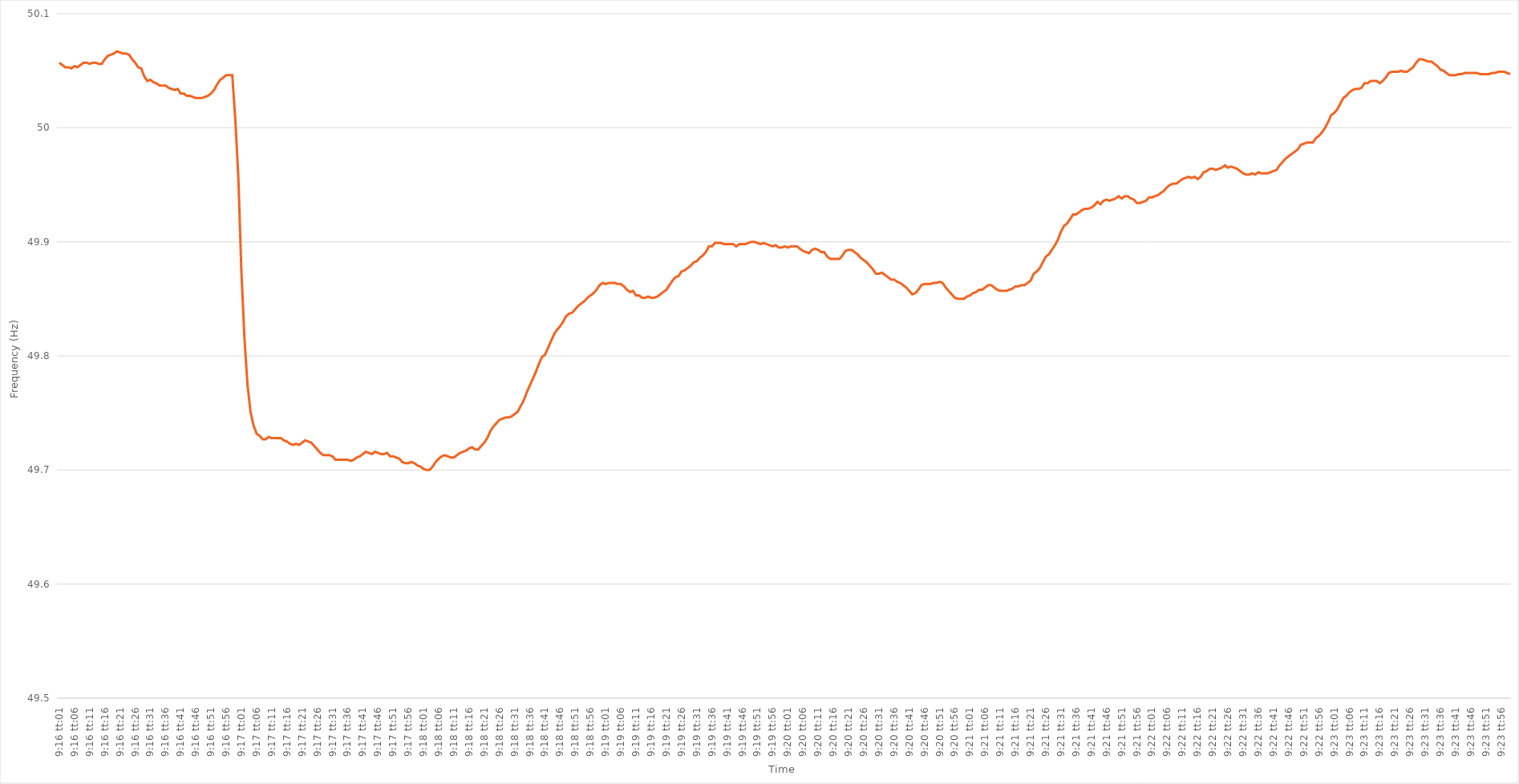
| Category | Series 0 |
|---|---|
| 0.38612268518518517 | 50.057 |
| 0.3861342592592593 | 50.055 |
| 0.38614583333333335 | 50.053 |
| 0.3861574074074074 | 50.053 |
| 0.3861689814814815 | 50.052 |
| 0.3861805555555555 | 50.054 |
| 0.3861921296296296 | 50.053 |
| 0.38620370370370366 | 50.055 |
| 0.3862152777777778 | 50.057 |
| 0.38622685185185185 | 50.057 |
| 0.38623842592592594 | 50.056 |
| 0.38625 | 50.057 |
| 0.3862615740740741 | 50.057 |
| 0.3862731481481481 | 50.056 |
| 0.38628472222222227 | 50.056 |
| 0.3862962962962963 | 50.06 |
| 0.3863078703703704 | 50.063 |
| 0.38631944444444444 | 50.064 |
| 0.38633101851851853 | 50.065 |
| 0.38634259259259257 | 50.067 |
| 0.3863541666666667 | 50.066 |
| 0.38636574074074076 | 50.065 |
| 0.3863773148148148 | 50.065 |
| 0.3863888888888889 | 50.064 |
| 0.38640046296296293 | 50.06 |
| 0.386412037037037 | 50.057 |
| 0.38642361111111106 | 50.053 |
| 0.3864351851851852 | 50.052 |
| 0.38644675925925925 | 50.045 |
| 0.38645833333333335 | 50.041 |
| 0.3864699074074074 | 50.042 |
| 0.3864814814814815 | 50.04 |
| 0.3864930555555555 | 50.039 |
| 0.38650462962962967 | 50.037 |
| 0.3865162037037037 | 50.037 |
| 0.3865277777777778 | 50.037 |
| 0.38653935185185184 | 50.035 |
| 0.38655092592592594 | 50.034 |
| 0.3865625 | 50.033 |
| 0.3865740740740741 | 50.034 |
| 0.38658564814814816 | 50.03 |
| 0.3865972222222222 | 50.03 |
| 0.3866087962962963 | 50.028 |
| 0.38662037037037034 | 50.028 |
| 0.38663194444444443 | 50.027 |
| 0.38664351851851847 | 50.026 |
| 0.3866550925925926 | 50.026 |
| 0.38666666666666666 | 50.026 |
| 0.38667824074074075 | 50.027 |
| 0.3866898148148148 | 50.028 |
| 0.3867013888888889 | 50.03 |
| 0.3867129629629629 | 50.033 |
| 0.3867245370370371 | 50.038 |
| 0.3867361111111111 | 50.042 |
| 0.3867476851851852 | 50.044 |
| 0.38675925925925925 | 50.046 |
| 0.38677083333333334 | 50.046 |
| 0.3867824074074074 | 50.046 |
| 0.38679398148148153 | 50.007 |
| 0.38680555555555557 | 49.956 |
| 0.38681712962962966 | 49.874 |
| 0.3868287037037037 | 49.816 |
| 0.3868402777777778 | 49.775 |
| 0.38685185185185184 | 49.751 |
| 0.3868634259259259 | 49.739 |
| 0.386875 | 49.732 |
| 0.38688657407407406 | 49.73 |
| 0.38689814814814816 | 49.727 |
| 0.3869097222222222 | 49.727 |
| 0.3869212962962963 | 49.729 |
| 0.38693287037037033 | 49.728 |
| 0.3869444444444445 | 49.728 |
| 0.3869560185185185 | 49.728 |
| 0.3869675925925926 | 49.728 |
| 0.38697916666666665 | 49.726 |
| 0.38699074074074075 | 49.725 |
| 0.3870023148148148 | 49.723 |
| 0.38701388888888894 | 49.722 |
| 0.387025462962963 | 49.723 |
| 0.38703703703703707 | 49.722 |
| 0.3870486111111111 | 49.724 |
| 0.3870601851851852 | 49.726 |
| 0.38707175925925924 | 49.725 |
| 0.3870833333333333 | 49.724 |
| 0.38709490740740743 | 49.721 |
| 0.38710648148148147 | 49.718 |
| 0.38711805555555556 | 49.715 |
| 0.3871296296296296 | 49.713 |
| 0.3871412037037037 | 49.713 |
| 0.38715277777777773 | 49.713 |
| 0.3871643518518519 | 49.712 |
| 0.3871759259259259 | 49.709 |
| 0.3871875 | 49.709 |
| 0.38719907407407406 | 49.709 |
| 0.38721064814814815 | 49.709 |
| 0.3872222222222222 | 49.709 |
| 0.38723379629629634 | 49.708 |
| 0.3872453703703704 | 49.709 |
| 0.3872569444444445 | 49.711 |
| 0.3872685185185185 | 49.712 |
| 0.3872800925925926 | 49.714 |
| 0.38729166666666665 | 49.716 |
| 0.3873032407407407 | 49.715 |
| 0.38731481481481483 | 49.714 |
| 0.3873263888888889 | 49.716 |
| 0.38733796296296297 | 49.715 |
| 0.387349537037037 | 49.714 |
| 0.3873611111111111 | 49.714 |
| 0.38737268518518514 | 49.715 |
| 0.3873842592592593 | 49.712 |
| 0.38739583333333333 | 49.712 |
| 0.3874074074074074 | 49.711 |
| 0.38741898148148146 | 49.71 |
| 0.38743055555555556 | 49.707 |
| 0.3874421296296296 | 49.706 |
| 0.38745370370370374 | 49.706 |
| 0.3874652777777778 | 49.707 |
| 0.3874768518518519 | 49.706 |
| 0.3874884259259259 | 49.704 |
| 0.3875 | 49.703 |
| 0.38751157407407405 | 49.701 |
| 0.3875231481481482 | 49.7 |
| 0.38753472222222224 | 49.7 |
| 0.38754629629629633 | 49.703 |
| 0.38755787037037037 | 49.707 |
| 0.3875694444444444 | 49.71 |
| 0.3875810185185185 | 49.712 |
| 0.38759259259259254 | 49.713 |
| 0.3876041666666667 | 49.712 |
| 0.38761574074074073 | 49.711 |
| 0.3876273148148148 | 49.711 |
| 0.38763888888888887 | 49.713 |
| 0.38765046296296296 | 49.715 |
| 0.387662037037037 | 49.716 |
| 0.38767361111111115 | 49.717 |
| 0.3876851851851852 | 49.719 |
| 0.3876967592592593 | 49.72 |
| 0.3877083333333333 | 49.718 |
| 0.3877199074074074 | 49.718 |
| 0.38773148148148145 | 49.721 |
| 0.3877430555555556 | 49.724 |
| 0.38775462962962964 | 49.728 |
| 0.38776620370370374 | 49.734 |
| 0.3877777777777778 | 49.738 |
| 0.3877893518518518 | 49.741 |
| 0.3878009259259259 | 49.744 |
| 0.38781249999999995 | 49.745 |
| 0.3878240740740741 | 49.746 |
| 0.38783564814814814 | 49.746 |
| 0.38784722222222223 | 49.747 |
| 0.38785879629629627 | 49.749 |
| 0.38787037037037037 | 49.751 |
| 0.3878819444444444 | 49.756 |
| 0.38789351851851855 | 49.761 |
| 0.3879050925925926 | 49.768 |
| 0.3879166666666667 | 49.774 |
| 0.3879282407407407 | 49.78 |
| 0.3879398148148148 | 49.786 |
| 0.38795138888888886 | 49.793 |
| 0.387962962962963 | 49.799 |
| 0.38797453703703705 | 49.801 |
| 0.38798611111111114 | 49.807 |
| 0.3879976851851852 | 49.813 |
| 0.3880092592592593 | 49.819 |
| 0.3880208333333333 | 49.823 |
| 0.38803240740740735 | 49.826 |
| 0.3880439814814815 | 49.83 |
| 0.38805555555555554 | 49.835 |
| 0.38806712962962964 | 49.837 |
| 0.3880787037037037 | 49.838 |
| 0.38809027777777777 | 49.841 |
| 0.3881018518518518 | 49.844 |
| 0.38811342592592596 | 49.846 |
| 0.388125 | 49.848 |
| 0.3881365740740741 | 49.851 |
| 0.38814814814814813 | 49.853 |
| 0.3881597222222222 | 49.855 |
| 0.38817129629629626 | 49.858 |
| 0.3881828703703704 | 49.862 |
| 0.38819444444444445 | 49.864 |
| 0.38820601851851855 | 49.863 |
| 0.3882175925925926 | 49.864 |
| 0.3882291666666667 | 49.864 |
| 0.3882407407407407 | 49.864 |
| 0.38825231481481487 | 49.863 |
| 0.3882638888888889 | 49.863 |
| 0.38827546296296295 | 49.861 |
| 0.38828703703703704 | 49.858 |
| 0.3882986111111111 | 49.856 |
| 0.3883101851851852 | 49.857 |
| 0.3883217592592592 | 49.853 |
| 0.38833333333333336 | 49.853 |
| 0.3883449074074074 | 49.851 |
| 0.3883564814814815 | 49.851 |
| 0.38836805555555554 | 49.852 |
| 0.38837962962962963 | 49.851 |
| 0.38839120370370367 | 49.851 |
| 0.3884027777777778 | 49.852 |
| 0.38841435185185186 | 49.854 |
| 0.38842592592592595 | 49.856 |
| 0.3884375 | 49.858 |
| 0.3884490740740741 | 49.862 |
| 0.3884606481481481 | 49.866 |
| 0.3884722222222223 | 49.869 |
| 0.3884837962962963 | 49.87 |
| 0.38849537037037035 | 49.874 |
| 0.38850694444444445 | 49.875 |
| 0.3885185185185185 | 49.877 |
| 0.3885300925925926 | 49.879 |
| 0.3885416666666666 | 49.882 |
| 0.38855324074074077 | 49.883 |
| 0.3885648148148148 | 49.886 |
| 0.3885763888888889 | 49.888 |
| 0.38858796296296294 | 49.891 |
| 0.38859953703703703 | 49.896 |
| 0.3886111111111111 | 49.896 |
| 0.3886226851851852 | 49.899 |
| 0.38863425925925926 | 49.899 |
| 0.38864583333333336 | 49.899 |
| 0.3886574074074074 | 49.898 |
| 0.3886689814814815 | 49.898 |
| 0.38868055555555553 | 49.898 |
| 0.3886921296296297 | 49.898 |
| 0.3887037037037037 | 49.896 |
| 0.3887152777777778 | 49.898 |
| 0.38872685185185185 | 49.898 |
| 0.38873842592592595 | 49.898 |
| 0.38875 | 49.899 |
| 0.388761574074074 | 49.9 |
| 0.3887731481481482 | 49.9 |
| 0.3887847222222222 | 49.899 |
| 0.3887962962962963 | 49.898 |
| 0.38880787037037035 | 49.899 |
| 0.38881944444444444 | 49.898 |
| 0.3888310185185185 | 49.897 |
| 0.38884259259259263 | 49.896 |
| 0.38885416666666667 | 49.897 |
| 0.38886574074074076 | 49.895 |
| 0.3888773148148148 | 49.895 |
| 0.3888888888888889 | 49.896 |
| 0.38890046296296293 | 49.895 |
| 0.3889120370370371 | 49.896 |
| 0.3889236111111111 | 49.896 |
| 0.3889351851851852 | 49.896 |
| 0.38894675925925926 | 49.894 |
| 0.38895833333333335 | 49.892 |
| 0.3889699074074074 | 49.891 |
| 0.38898148148148143 | 49.89 |
| 0.3889930555555556 | 49.893 |
| 0.3890046296296296 | 49.894 |
| 0.3890162037037037 | 49.893 |
| 0.38902777777777775 | 49.891 |
| 0.38903935185185184 | 49.891 |
| 0.3890509259259259 | 49.887 |
| 0.38906250000000003 | 49.885 |
| 0.38907407407407407 | 49.885 |
| 0.38908564814814817 | 49.885 |
| 0.3890972222222222 | 49.885 |
| 0.3891087962962963 | 49.888 |
| 0.38912037037037034 | 49.892 |
| 0.3891319444444445 | 49.893 |
| 0.3891435185185185 | 49.893 |
| 0.3891550925925926 | 49.891 |
| 0.38916666666666666 | 49.889 |
| 0.38917824074074076 | 49.886 |
| 0.3891898148148148 | 49.884 |
| 0.38920138888888883 | 49.882 |
| 0.389212962962963 | 49.879 |
| 0.389224537037037 | 49.876 |
| 0.3892361111111111 | 49.872 |
| 0.38924768518518515 | 49.872 |
| 0.38925925925925925 | 49.873 |
| 0.3892708333333333 | 49.871 |
| 0.38928240740740744 | 49.869 |
| 0.3892939814814815 | 49.867 |
| 0.38930555555555557 | 49.867 |
| 0.3893171296296296 | 49.865 |
| 0.3893287037037037 | 49.864 |
| 0.38934027777777774 | 49.862 |
| 0.3893518518518519 | 49.86 |
| 0.38936342592592593 | 49.857 |
| 0.389375 | 49.854 |
| 0.38938657407407407 | 49.855 |
| 0.38939814814814816 | 49.858 |
| 0.3894097222222222 | 49.862 |
| 0.38942129629629635 | 49.863 |
| 0.3894328703703704 | 49.863 |
| 0.3894444444444445 | 49.863 |
| 0.3894560185185185 | 49.864 |
| 0.38946759259259256 | 49.864 |
| 0.38947916666666665 | 49.865 |
| 0.3894907407407407 | 49.864 |
| 0.38950231481481484 | 49.86 |
| 0.3895138888888889 | 49.857 |
| 0.389525462962963 | 49.854 |
| 0.389537037037037 | 49.851 |
| 0.3895486111111111 | 49.85 |
| 0.38956018518518515 | 49.85 |
| 0.3895717592592593 | 49.85 |
| 0.38958333333333334 | 49.852 |
| 0.38959490740740743 | 49.853 |
| 0.38960648148148147 | 49.855 |
| 0.38961805555555556 | 49.856 |
| 0.3896296296296296 | 49.858 |
| 0.38964120370370375 | 49.858 |
| 0.3896527777777778 | 49.86 |
| 0.3896643518518519 | 49.862 |
| 0.3896759259259259 | 49.862 |
| 0.38968749999999996 | 49.86 |
| 0.38969907407407406 | 49.858 |
| 0.3897106481481481 | 49.857 |
| 0.38972222222222225 | 49.857 |
| 0.3897337962962963 | 49.857 |
| 0.3897453703703704 | 49.858 |
| 0.3897569444444444 | 49.859 |
| 0.3897685185185185 | 49.861 |
| 0.38978009259259255 | 49.861 |
| 0.3897916666666667 | 49.862 |
| 0.38980324074074074 | 49.862 |
| 0.38981481481481484 | 49.864 |
| 0.3898263888888889 | 49.866 |
| 0.38983796296296297 | 49.872 |
| 0.389849537037037 | 49.874 |
| 0.38986111111111116 | 49.877 |
| 0.3898726851851852 | 49.882 |
| 0.3898842592592593 | 49.887 |
| 0.38989583333333333 | 49.889 |
| 0.38990740740740737 | 49.893 |
| 0.38991898148148146 | 49.897 |
| 0.3899305555555555 | 49.902 |
| 0.38994212962962965 | 49.909 |
| 0.3899537037037037 | 49.914 |
| 0.3899652777777778 | 49.916 |
| 0.3899768518518518 | 49.92 |
| 0.3899884259259259 | 49.924 |
| 0.38999999999999996 | 49.924 |
| 0.3900115740740741 | 49.926 |
| 0.39002314814814815 | 49.928 |
| 0.39003472222222224 | 49.929 |
| 0.3900462962962963 | 49.929 |
| 0.3900578703703704 | 49.93 |
| 0.3900694444444444 | 49.932 |
| 0.39008101851851856 | 49.935 |
| 0.3900925925925926 | 49.933 |
| 0.3901041666666667 | 49.936 |
| 0.39011574074074074 | 49.937 |
| 0.39012731481481483 | 49.936 |
| 0.39013888888888887 | 49.937 |
| 0.390150462962963 | 49.938 |
| 0.39016203703703706 | 49.94 |
| 0.3901736111111111 | 49.938 |
| 0.3901851851851852 | 49.94 |
| 0.39019675925925923 | 49.94 |
| 0.3902083333333333 | 49.938 |
| 0.39021990740740736 | 49.937 |
| 0.3902314814814815 | 49.934 |
| 0.39024305555555555 | 49.934 |
| 0.39025462962962965 | 49.935 |
| 0.3902662037037037 | 49.936 |
| 0.3902777777777778 | 49.939 |
| 0.3902893518518518 | 49.939 |
| 0.39030092592592597 | 49.94 |
| 0.3903125 | 49.941 |
| 0.3903240740740741 | 49.943 |
| 0.39033564814814814 | 49.945 |
| 0.39034722222222223 | 49.948 |
| 0.3903587962962963 | 49.95 |
| 0.3903703703703704 | 49.951 |
| 0.39038194444444446 | 49.951 |
| 0.3903935185185185 | 49.953 |
| 0.3904050925925926 | 49.955 |
| 0.39041666666666663 | 49.956 |
| 0.39042824074074073 | 49.957 |
| 0.39043981481481477 | 49.956 |
| 0.3904513888888889 | 49.957 |
| 0.39046296296296296 | 49.955 |
| 0.39047453703703705 | 49.957 |
| 0.3904861111111111 | 49.961 |
| 0.3904976851851852 | 49.962 |
| 0.3905092592592592 | 49.964 |
| 0.3905208333333334 | 49.964 |
| 0.3905324074074074 | 49.963 |
| 0.3905439814814815 | 49.964 |
| 0.39055555555555554 | 49.965 |
| 0.39056712962962964 | 49.967 |
| 0.3905787037037037 | 49.965 |
| 0.39059027777777783 | 49.966 |
| 0.39060185185185187 | 49.965 |
| 0.39061342592592596 | 49.964 |
| 0.390625 | 49.962 |
| 0.39063657407407404 | 49.96 |
| 0.39064814814814813 | 49.959 |
| 0.39065972222222217 | 49.959 |
| 0.3906712962962963 | 49.96 |
| 0.39068287037037036 | 49.959 |
| 0.39069444444444446 | 49.961 |
| 0.3907060185185185 | 49.96 |
| 0.3907175925925926 | 49.96 |
| 0.3907291666666666 | 49.96 |
| 0.3907407407407408 | 49.961 |
| 0.3907523148148148 | 49.962 |
| 0.3907638888888889 | 49.963 |
| 0.39077546296296295 | 49.967 |
| 0.39078703703703704 | 49.97 |
| 0.3907986111111111 | 49.973 |
| 0.39081018518518523 | 49.975 |
| 0.39082175925925927 | 49.977 |
| 0.39083333333333337 | 49.979 |
| 0.3908449074074074 | 49.981 |
| 0.3908564814814815 | 49.985 |
| 0.39086805555555554 | 49.986 |
| 0.3908796296296296 | 49.987 |
| 0.3908912037037037 | 49.987 |
| 0.39090277777777777 | 49.987 |
| 0.39091435185185186 | 49.991 |
| 0.3909259259259259 | 49.993 |
| 0.3909375 | 49.996 |
| 0.39094907407407403 | 50 |
| 0.3909606481481482 | 50.005 |
| 0.3909722222222222 | 50.011 |
| 0.3909837962962963 | 50.013 |
| 0.39099537037037035 | 50.016 |
| 0.39100694444444445 | 50.021 |
| 0.3910185185185185 | 50.026 |
| 0.39103009259259264 | 50.028 |
| 0.3910416666666667 | 50.031 |
| 0.39105324074074077 | 50.033 |
| 0.3910648148148148 | 50.034 |
| 0.3910763888888889 | 50.034 |
| 0.39108796296296294 | 50.035 |
| 0.391099537037037 | 50.039 |
| 0.39111111111111113 | 50.039 |
| 0.39112268518518517 | 50.041 |
| 0.39113425925925926 | 50.041 |
| 0.3911458333333333 | 50.041 |
| 0.3911574074074074 | 50.039 |
| 0.39116898148148144 | 50.041 |
| 0.3911805555555556 | 50.044 |
| 0.3911921296296296 | 50.048 |
| 0.3912037037037037 | 50.049 |
| 0.39121527777777776 | 50.049 |
| 0.39122685185185185 | 50.049 |
| 0.3912384259259259 | 50.05 |
| 0.39125000000000004 | 50.049 |
| 0.3912615740740741 | 50.049 |
| 0.3912731481481482 | 50.051 |
| 0.3912847222222222 | 50.053 |
| 0.3912962962962963 | 50.057 |
| 0.39130787037037035 | 50.06 |
| 0.3913194444444445 | 50.06 |
| 0.39133101851851854 | 50.059 |
| 0.39134259259259263 | 50.058 |
| 0.39135416666666667 | 50.058 |
| 0.3913657407407407 | 50.056 |
| 0.3913773148148148 | 50.054 |
| 0.39138888888888884 | 50.051 |
| 0.391400462962963 | 50.05 |
| 0.39141203703703703 | 50.048 |
| 0.3914236111111111 | 50.046 |
| 0.39143518518518516 | 50.046 |
| 0.39144675925925926 | 50.046 |
| 0.3914583333333333 | 50.047 |
| 0.39146990740740745 | 50.047 |
| 0.3914814814814815 | 50.048 |
| 0.3914930555555556 | 50.048 |
| 0.3915046296296296 | 50.048 |
| 0.3915162037037037 | 50.048 |
| 0.39152777777777775 | 50.048 |
| 0.3915393518518519 | 50.047 |
| 0.39155092592592594 | 50.047 |
| 0.39156250000000004 | 50.047 |
| 0.3915740740740741 | 50.047 |
| 0.3915856481481481 | 50.048 |
| 0.3915972222222222 | 50.048 |
| 0.39160879629629625 | 50.049 |
| 0.3916203703703704 | 50.049 |
| 0.39163194444444444 | 50.049 |
| 0.39164351851851853 | 50.048 |
| 0.39165509259259257 | 50.047 |